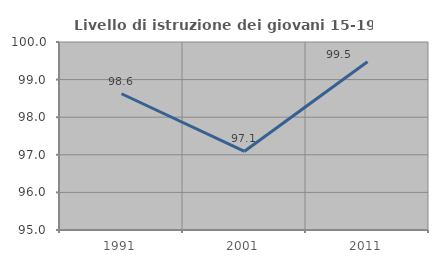
| Category | Livello di istruzione dei giovani 15-19 anni |
|---|---|
| 1991.0 | 98.624 |
| 2001.0 | 97.093 |
| 2011.0 | 99.476 |